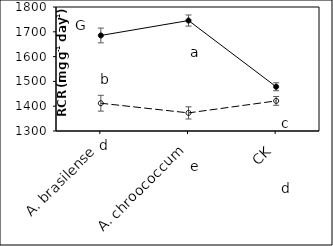
| Category | Bt | Xy |
|---|---|---|
|    A. brasilense | 1685.257 | 1411.984 |
|    A. chroococcum | 1745.416 | 1372.988 |
| CK | 1478.396 | 1421.363 |